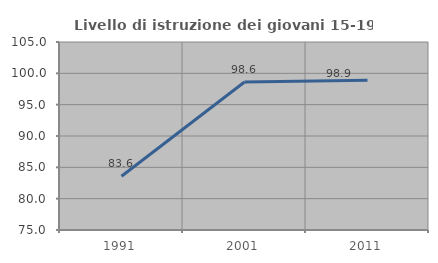
| Category | Livello di istruzione dei giovani 15-19 anni |
|---|---|
| 1991.0 | 83.571 |
| 2001.0 | 98.611 |
| 2011.0 | 98.913 |